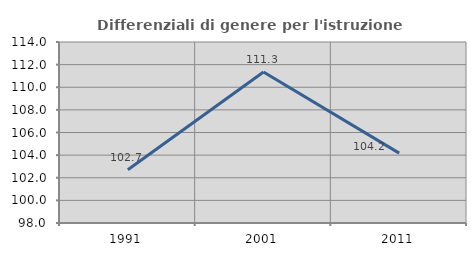
| Category | Differenziali di genere per l'istruzione superiore |
|---|---|
| 1991.0 | 102.712 |
| 2001.0 | 111.345 |
| 2011.0 | 104.174 |